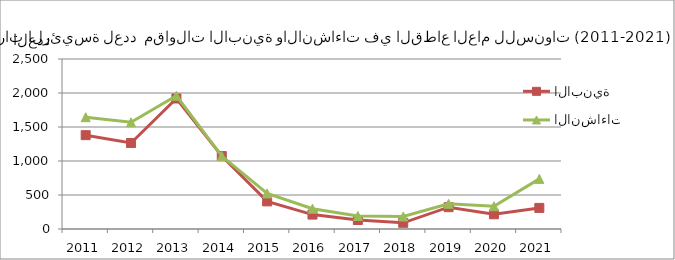
| Category | الابنية | الانشاءات |
|---|---|---|
| 2011.0 | 1380 | 1644 |
| 2012.0 | 1265 | 1570 |
| 2013.0 | 1919 | 1959 |
| 2014.0 | 1073 | 1073 |
| 2015.0 | 406 | 523 |
| 2016.0 | 212 | 299 |
| 2017.0 | 132 | 191 |
| 2018.0 | 91 | 184 |
| 2019.0 | 321 | 370 |
| 2020.0 | 216 | 335 |
| 2021.0 | 310 | 737 |